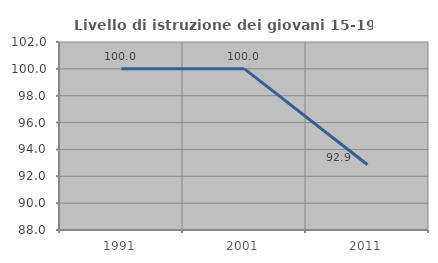
| Category | Livello di istruzione dei giovani 15-19 anni |
|---|---|
| 1991.0 | 100 |
| 2001.0 | 100 |
| 2011.0 | 92.857 |